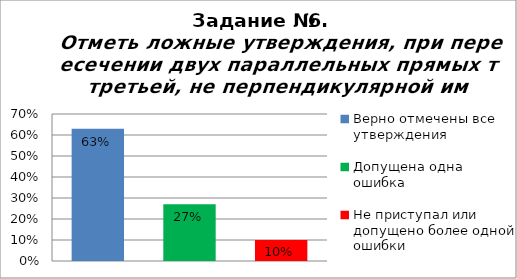
| Category | Отметь ложные утверждения, при пересечении двух параллельных прямых третьей, не перпендикулярной им. |
|---|---|
| Верно отмечены все утверждения | 0.63 |
| Допущена одна ошибка | 0.27 |
| Не приступал или допущено более одной ошибки | 0.1 |